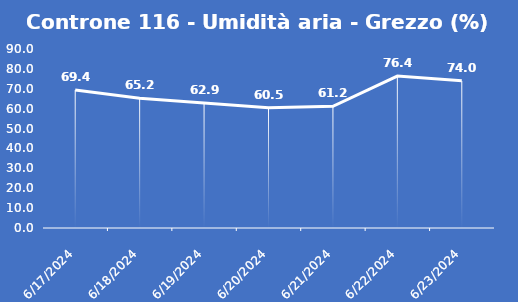
| Category | Controne 116 - Umidità aria - Grezzo (%) |
|---|---|
| 6/17/24 | 69.4 |
| 6/18/24 | 65.2 |
| 6/19/24 | 62.9 |
| 6/20/24 | 60.5 |
| 6/21/24 | 61.2 |
| 6/22/24 | 76.4 |
| 6/23/24 | 74 |